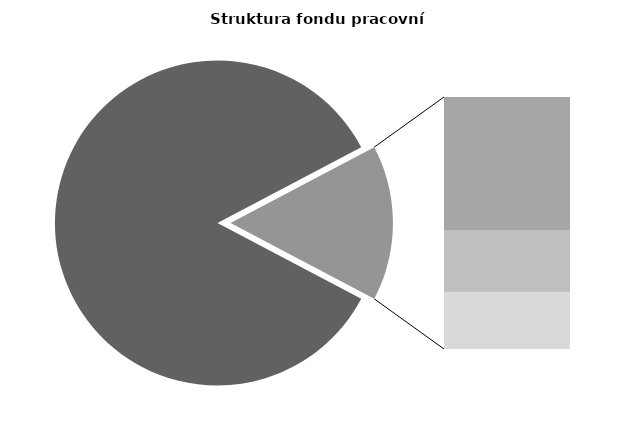
| Category | Series 0 |
|---|---|
| Průměrná měsíční odpracovaná doba bez přesčasu | 142.902 |
| Dovolená | 13.786 |
| Nemoc | 6.466 |
| Jiné | 5.873 |